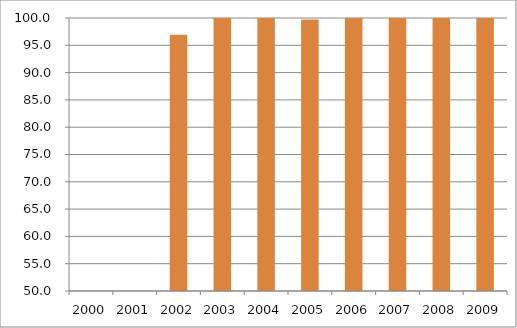
| Category | Brasil |
|---|---|
| 2000.0 | 0 |
| 2001.0 | 0 |
| 2002.0 | 96.92 |
| 2003.0 | 112.95 |
| 2004.0 | 105.02 |
| 2005.0 | 99.72 |
| 2006.0 | 102.24 |
| 2007.0 | 104.88 |
| 2008.0 | 101.31 |
| 2009.0 | 101.8 |